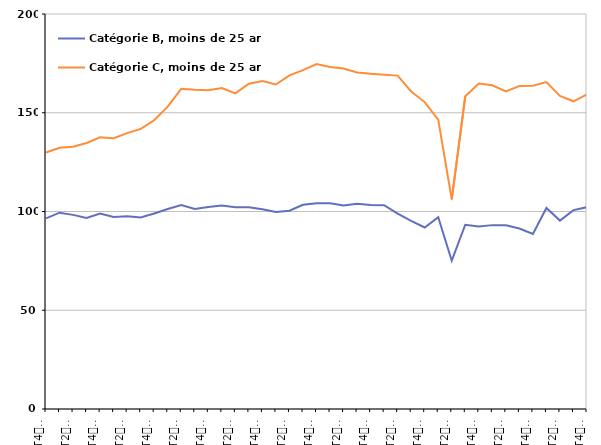
| Category | Catégorie B, moins de 25 ans | Catégorie C, moins de 25 ans |
|---|---|---|
| T4
2012 | 96.5 | 129.9 |
| T1
2013 | 99.4 | 132.3 |
| T2
2013 | 98.3 | 132.8 |
| T3
2013 | 96.7 | 134.7 |
| T4
2013 | 99 | 137.6 |
| T1
2014 | 97.2 | 137.1 |
| T2
2014 | 97.6 | 139.7 |
| T3
2014 | 97 | 141.8 |
| T4
2014 | 99 | 146.2 |
| T1
2015 | 101.3 | 153.1 |
| T2
2015 | 103.3 | 162.1 |
| T3
2015 | 101.3 | 161.6 |
| T4
2015 | 102.3 | 161.4 |
| T1
2016 | 103 | 162.5 |
| T2
2016 | 102.1 | 159.8 |
| T3
2016 | 102.2 | 164.7 |
| T4
2016 | 101.1 | 166.1 |
| T1
2017 | 99.7 | 164.3 |
| T2
2017 | 100.4 | 168.9 |
| T3
2017 | 103.4 | 171.6 |
| T4
2017 | 104.2 | 174.7 |
| T1
2018 | 104.2 | 173.2 |
| T2
2018 | 103 | 172.4 |
| T3
2018 | 103.9 | 170.4 |
| T4
2018 | 103.3 | 169.7 |
| T1
2019 | 103.2 | 169.3 |
| T2
2019 | 98.9 | 168.8 |
| T3
2019 | 95.3 | 160.8 |
| T4
2019 | 91.9 | 155.4 |
| T1
2020 | 97.1 | 146.5 |
| T2
2020 | 75.1 | 106.1 |
| T3
2020 | 93.3 | 158.4 |
| T4
2020 | 92.4 | 164.8 |
| T1
2021 | 93.1 | 163.9 |
| T2
2021 | 93 | 160.8 |
| T3
2021 | 91.4 | 163.5 |
| T4
2021 | 88.6 | 163.7 |
| T1
2022 | 101.8 | 165.5 |
| T2
2022 | 95.4 | 158.5 |
| T3
2022 | 100.7 | 155.8 |
| T4
2022 | 102.2 | 159.3 |